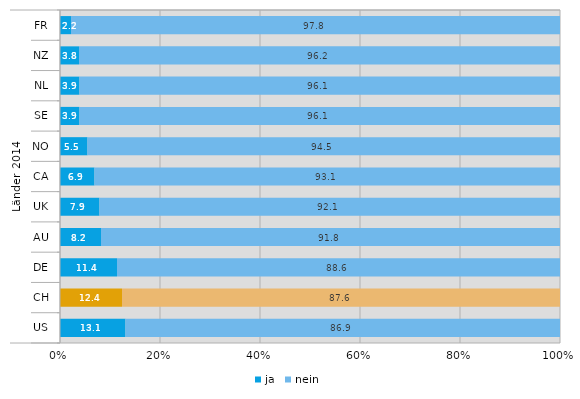
| Category | ja | nein |
|---|---|---|
| 0 | 2.2 | 97.8 |
| 1 | 3.8 | 96.2 |
| 2 | 3.9 | 96.1 |
| 3 | 3.9 | 96.1 |
| 4 | 5.5 | 94.5 |
| 5 | 6.9 | 93.1 |
| 6 | 7.9 | 92.1 |
| 7 | 8.2 | 91.8 |
| 8 | 11.4 | 88.6 |
| 9 | 12.4 | 87.6 |
| 10 | 13.1 | 86.9 |